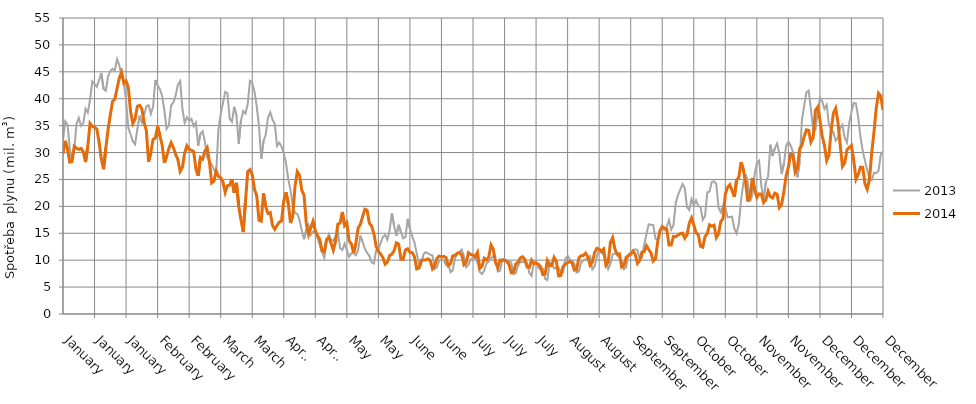
| Category | 2013 | 2014 |
|---|---|---|
| 2014-01-01 | 32.376 | 29.82 |
| 2014-01-02 | 35.793 | 32.181 |
| 2014-01-03 | 35.21 | 30.611 |
| 2014-01-04 | 30.842 | 28.224 |
| 2014-01-05 | 28.424 | 28.324 |
| 2014-01-06 | 30.508 | 31.172 |
| 2014-01-07 | 35.327 | 30.817 |
| 2014-01-08 | 36.448 | 30.577 |
| 2014-01-09 | 34.966 | 30.778 |
| 2014-01-10 | 35.419 | 30.133 |
| 2014-01-11 | 38.147 | 28.232 |
| 2014-01-12 | 37.43 | 31.153 |
| 2014-01-13 | 39.765 | 35.426 |
| 2014-01-14 | 43.228 | 34.839 |
| 2014-01-15 | 42.74 | 34.682 |
| 2014-01-16 | 42.229 | 34.385 |
| 2014-01-17 | 43.467 | 32.005 |
| 2014-01-18 | 44.768 | 28.838 |
| 2014-01-19 | 41.827 | 26.915 |
| 2014-01-20 | 41.464 | 30.805 |
| 2014-01-21 | 44.137 | 34.269 |
| 2014-01-22 | 45.154 | 36.969 |
| 2014-01-23 | 45.558 | 39.516 |
| 2014-01-24 | 45.237 | 39.913 |
| 2014-01-25 | 47.333 | 41.907 |
| 2014-01-26 | 46.198 | 43.864 |
| 2014-01-27 | 44.24 | 44.959 |
| 2014-01-28 | 43.061 | 42.901 |
| 2014-01-29 | 39.625 | 43.3 |
| 2014-01-30 | 34.589 | 42.101 |
| 2014-01-31 | 33.34 | 37.605 |
| 2014-02-01 | 32.074 | 35.402 |
| 2014-02-02 | 31.529 | 36.256 |
| 2014-02-03 | 34.36 | 38.573 |
| 2014-02-04 | 36.834 | 38.774 |
| 2014-02-05 | 35.587 | 38.146 |
| 2014-02-06 | 36.952 | 35.601 |
| 2014-02-07 | 38.576 | 34.087 |
| 2014-02-08 | 38.79 | 28.272 |
| 2014-02-09 | 37.172 | 30.067 |
| 2014-02-10 | 38.555 | 32.449 |
| 2014-02-11 | 43.474 | 32.699 |
| 2014-02-12 | 42.481 | 34.883 |
| 2014-02-13 | 41.749 | 33.102 |
| 2014-02-14 | 40.527 | 31.441 |
| 2014-02-15 | 37.804 | 28.101 |
| 2014-02-16 | 34.402 | 29.299 |
| 2014-02-17 | 35.141 | 30.772 |
| 2014-02-18 | 38.759 | 31.843 |
| 2014-02-19 | 39.327 | 30.935 |
| 2014-02-20 | 40.591 | 29.665 |
| 2014-02-21 | 42.629 | 28.691 |
| 2014-02-22 | 43.266 | 26.488 |
| 2014-02-23 | 38.174 | 27.234 |
| 2014-02-24 | 35.521 | 29.906 |
| 2014-02-25 | 36.541 | 31.251 |
| 2014-02-26 | 35.922 | 30.589 |
| 2014-02-27 | 36.258 | 30.439 |
| 2014-02-28 | 34.882 | 30.176 |
| 2014-03-01 | 35.558 | 26.972 |
| 2014-03-02 | 31.279 | 25.663 |
| 2014-03-03 | 33.478 | 29.095 |
| 2014-03-04 | 33.95 | 28.784 |
| 2014-03-05 | 31.968 | 30.254 |
| 2014-03-06 | 29.166 | 30.9 |
| 2014-03-07 | 28.263 | 28.308 |
| 2014-03-08 | 27.794 | 24.338 |
| 2014-03-09 | 26.809 | 24.66 |
| 2014-03-10 | 26.168 | 26.562 |
| 2014-03-11 | 34.32 | 25.574 |
| 2014-03-12 | 37.177 | 25.344 |
| 2014-03-13 | 39.187 | 24.546 |
| 2014-03-14 | 41.267 | 22.59 |
| 2014-03-15 | 41.026 | 23.848 |
| 2014-03-16 | 36.273 | 23.956 |
| 2014-03-17 | 35.707 | 25.066 |
| 2014-03-18 | 38.486 | 22.511 |
| 2014-03-19 | 36.897 | 24.371 |
| 2014-03-20 | 31.613 | 20.079 |
| 2014-03-21 | 35.967 | 17.453 |
| 2014-03-22 | 37.7 | 15.233 |
| 2014-03-23 | 37.236 | 20.937 |
| 2014-03-24 | 39.01 | 26.456 |
| 2014-03-25 | 43.322 | 26.817 |
| 2014-03-26 | 42.96 | 25.922 |
| 2014-03-27 | 41.318 | 23.174 |
| 2014-03-28 | 38.564 | 21.96 |
| 2014-03-29 | 34.957 | 17.409 |
| 2014-03-30 | 28.849 | 17.253 |
| 2014-03-31 | 32.112 | 22.417 |
| 2014-04-01 | 33.361 | 19.913 |
| 2014-04-02 | 36.491 | 18.679 |
| 2014-04-03 | 37.49 | 18.853 |
| 2014-04-04 | 36.084 | 16.457 |
| 2014-04-05 | 35.336 | 15.742 |
| 2014-04-06 | 31.221 | 16.457 |
| 2014-04-07 | 31.847 | 17.07 |
| 2014-04-08 | 31.129 | 17.279 |
| 2014-04-09 | 29.838 | 20.99 |
| 2014-04-10 | 28.022 | 22.604 |
| 2014-04-11 | 25.047 | 20.575 |
| 2014-04-12 | 23.005 | 16.912 |
| 2014-04-13 | 20.113 | 18.289 |
| 2014-04-14 | 18.796 | 23.767 |
| 2014-04-15 | 18.589 | 26.464 |
| 2014-04-16 | 17.46 | 25.756 |
| 2014-04-17 | 15.497 | 22.989 |
| 2014-04-18 | 13.898 | 22.107 |
| 2014-04-19 | 15.681 | 16.761 |
| 2014-04-20 | 16.576 | 14.747 |
| 2014-04-21 | 14.706 | 15.992 |
| 2014-04-22 | 15.291 | 17.229 |
| 2014-04-23 | 14.912 | 15.478 |
| 2014-04-24 | 14.147 | 14.555 |
| 2014-04-25 | 12.78 | 13.828 |
| 2014-04-26 | 11.422 | 11.757 |
| 2014-04-27 | 10.43 | 11.546 |
| 2014-04-28 | 13.422 | 13.87 |
| 2014-04-29 | 14.823 | 14.203 |
| 2014-04-30 | 13.827 | 13.119 |
| 2014-05-01 | 13.576 | 11.84 |
| 2014-05-02 | 14.447 | 13.531 |
| 2014-05-03 | 15.286 | 16.691 |
| 2014-05-04 | 12.215 | 16.898 |
| 2014-05-05 | 11.903 | 18.958 |
| 2014-05-06 | 13.077 | 16.412 |
| 2014-05-07 | 11.894 | 16.923 |
| 2014-05-08 | 10.628 | 13.589 |
| 2014-05-09 | 11.271 | 13.035 |
| 2014-05-10 | 11.317 | 11.395 |
| 2014-05-11 | 10.92 | 13.101 |
| 2014-05-12 | 11.847 | 15.969 |
| 2014-05-13 | 14.53 | 16.661 |
| 2014-05-14 | 13.425 | 18.088 |
| 2014-05-15 | 12.132 | 19.465 |
| 2014-05-16 | 11.361 | 19.279 |
| 2014-05-17 | 10.781 | 16.828 |
| 2014-05-18 | 9.617 | 16.379 |
| 2014-05-19 | 9.388 | 14.918 |
| 2014-05-20 | 11.813 | 12.583 |
| 2014-05-21 | 12 | 11.656 |
| 2014-05-22 | 13.191 | 11.132 |
| 2014-05-23 | 14.31 | 10.478 |
| 2014-05-24 | 14.698 | 9.278 |
| 2014-05-25 | 13.8 | 9.656 |
| 2014-05-26 | 15.615 | 10.866 |
| 2014-05-27 | 18.75 | 11.109 |
| 2014-05-28 | 16.366 | 11.809 |
| 2014-05-29 | 14.502 | 13.226 |
| 2014-05-30 | 16.586 | 12.988 |
| 2014-05-31 | 15.247 | 10.185 |
| 2014-06-01 | 14.068 | 10.152 |
| 2014-06-02 | 14.284 | 11.905 |
| 2014-06-03 | 17.667 | 12.107 |
| 2014-06-04 | 15.87 | 11.447 |
| 2014-06-05 | 14.467 | 11.438 |
| 2014-06-06 | 13.277 | 10.651 |
| 2014-06-07 | 11.324 | 8.371 |
| 2014-06-08 | 9.197 | 8.523 |
| 2014-06-09 | 9.082 | 9.971 |
| 2014-06-10 | 11.078 | 10.028 |
| 2014-06-11 | 11.485 | 10.044 |
| 2014-06-12 | 11.284 | 10.241 |
| 2014-06-13 | 11.01 | 9.964 |
| 2014-06-14 | 10.914 | 8.394 |
| 2014-06-15 | 8.349 | 8.962 |
| 2014-06-16 | 8.697 | 10.347 |
| 2014-06-17 | 9.974 | 10.761 |
| 2014-06-18 | 10.104 | 10.601 |
| 2014-06-19 | 10.037 | 10.714 |
| 2014-06-20 | 9.089 | 10.507 |
| 2014-06-21 | 9.375 | 9.013 |
| 2014-06-22 | 7.746 | 9.332 |
| 2014-06-23 | 8.13 | 10.793 |
| 2014-06-24 | 10.301 | 10.893 |
| 2014-06-25 | 11.16 | 11.273 |
| 2014-06-26 | 11.523 | 11.412 |
| 2014-06-27 | 11.957 | 10.932 |
| 2014-06-28 | 10.728 | 9.155 |
| 2014-06-29 | 8.701 | 9.581 |
| 2014-06-30 | 9.167 | 11.386 |
| 2014-07-01 | 10.198 | 11.058 |
| 2014-07-02 | 10.355 | 10.945 |
| 2014-07-03 | 10.447 | 10.6 |
| 2014-07-04 | 9.637 | 11.434 |
| 2014-07-05 | 7.812 | 8.493 |
| 2014-07-06 | 7.434 | 8.861 |
| 2014-07-07 | 8.051 | 10.347 |
| 2014-07-08 | 9.423 | 10.041 |
| 2014-07-09 | 9.745 | 10.6 |
| 2014-07-10 | 10.311 | 12.823 |
| 2014-07-11 | 10.735 | 12.053 |
| 2014-07-12 | 10.32 | 9.57 |
| 2014-07-13 | 7.898 | 8.633 |
| 2014-07-14 | 8.037 | 10.024 |
| 2014-07-15 | 10.124 | 9.977 |
| 2014-07-16 | 10.333 | 9.934 |
| 2014-07-17 | 9.53 | 9.835 |
| 2014-07-18 | 9.914 | 9.179 |
| 2014-07-19 | 9.567 | 7.672 |
| 2014-07-20 | 7.393 | 7.804 |
| 2014-07-21 | 7.651 | 9.301 |
| 2014-07-22 | 8.974 | 9.613 |
| 2014-07-23 | 9.696 | 10.428 |
| 2014-07-24 | 9.603 | 10.63 |
| 2014-07-25 | 9.818 | 10.15 |
| 2014-07-26 | 9.457 | 8.739 |
| 2014-07-27 | 7.647 | 8.655 |
| 2014-07-28 | 7.082 | 10.007 |
| 2014-07-29 | 9.479 | 9.354 |
| 2014-07-30 | 9.775 | 9.452 |
| 2014-07-31 | 8.559 | 9.247 |
| 2014-08-01 | 8.281 | 8.753 |
| 2014-08-02 | 8.408 | 7.34 |
| 2014-08-03 | 6.562 | 7.426 |
| 2014-08-04 | 6.288 | 9.929 |
| 2014-08-05 | 9.544 | 9.006 |
| 2014-08-06 | 9.275 | 9.029 |
| 2014-08-07 | 8.467 | 10.52 |
| 2014-08-08 | 8.583 | 9.784 |
| 2014-08-09 | 8.562 | 7.091 |
| 2014-08-10 | 7.859 | 7.163 |
| 2014-08-11 | 7.786 | 8.833 |
| 2014-08-12 | 10.258 | 9.249 |
| 2014-08-13 | 10.836 | 9.55 |
| 2014-08-14 | 10.13 | 9.739 |
| 2014-08-15 | 9.877 | 9.465 |
| 2014-08-16 | 9.389 | 8.167 |
| 2014-08-17 | 7.708 | 8.264 |
| 2014-08-18 | 7.896 | 10.437 |
| 2014-08-19 | 9.576 | 10.817 |
| 2014-08-20 | 9.953 | 10.876 |
| 2014-08-21 | 10.157 | 11.292 |
| 2014-08-22 | 10.387 | 10.609 |
| 2014-08-23 | 10.739 | 9.077 |
| 2014-08-24 | 8.28 | 9.681 |
| 2014-08-25 | 8.804 | 11.402 |
| 2014-08-26 | 10.717 | 12.199 |
| 2014-08-27 | 11.891 | 12.04 |
| 2014-08-28 | 11.407 | 11.614 |
| 2014-08-29 | 10.979 | 12.056 |
| 2014-08-30 | 10.106 | 9.031 |
| 2014-08-31 | 8.358 | 9.591 |
| 2014-09-01 | 9.321 | 13.327 |
| 2014-09-02 | 11.074 | 14.197 |
| 2014-09-03 | 11.277 | 12.059 |
| 2014-09-04 | 10.901 | 11.153 |
| 2014-09-05 | 10.488 | 11.189 |
| 2014-09-06 | 9.822 | 8.718 |
| 2014-09-07 | 8.302 | 9.013 |
| 2014-09-08 | 8.699 | 10.548 |
| 2014-09-09 | 10.995 | 10.863 |
| 2014-09-10 | 11.449 | 11.09 |
| 2014-09-11 | 11.804 | 11.667 |
| 2014-09-12 | 12.028 | 11.077 |
| 2014-09-13 | 11.87 | 9.402 |
| 2014-09-14 | 10.22 | 9.952 |
| 2014-09-15 | 10.465 | 11.503 |
| 2014-09-16 | 12.822 | 11.575 |
| 2014-09-17 | 14.864 | 12.671 |
| 2014-09-18 | 16.669 | 11.99 |
| 2014-09-19 | 16.575 | 11.364 |
| 2014-09-20 | 16.527 | 9.821 |
| 2014-09-21 | 14.005 | 10.25 |
| 2014-09-22 | 13.755 | 13.442 |
| 2014-09-23 | 15.566 | 15.491 |
| 2014-09-24 | 15.919 | 16.249 |
| 2014-09-25 | 15.573 | 15.94 |
| 2014-09-26 | 16.167 | 15.785 |
| 2014-09-27 | 17.459 | 12.817 |
| 2014-09-28 | 15.679 | 12.839 |
| 2014-09-29 | 16.502 | 14.428 |
| 2014-09-30 | 20.599 | 14.343 |
| 2014-10-01 | 22.132 | 14.673 |
| 2014-10-02 | 23.106 | 14.937 |
| 2014-10-03 | 24.155 | 15.024 |
| 2014-10-04 | 23.372 | 14.082 |
| 2014-10-05 | 19.838 | 14.704 |
| 2014-10-06 | 19.324 | 16.851 |
| 2014-10-07 | 21.353 | 17.837 |
| 2014-10-08 | 20.17 | 16.557 |
| 2014-10-09 | 21.117 | 15.093 |
| 2014-10-10 | 20.039 | 14.757 |
| 2014-10-11 | 19.909 | 12.578 |
| 2014-10-12 | 17.475 | 12.42 |
| 2014-10-13 | 18.207 | 14.38 |
| 2014-10-14 | 22.589 | 14.976 |
| 2014-10-15 | 22.767 | 16.573 |
| 2014-10-16 | 24.55 | 16.323 |
| 2014-10-17 | 24.644 | 16.501 |
| 2014-10-18 | 24.168 | 14.212 |
| 2014-10-19 | 19.773 | 14.948 |
| 2014-10-20 | 18.881 | 17.188 |
| 2014-10-21 | 20.205 | 17.722 |
| 2014-10-22 | 19.771 | 22.243 |
| 2014-10-23 | 17.971 | 23.528 |
| 2014-10-24 | 18.007 | 24.017 |
| 2014-10-25 | 18.081 | 22.938 |
| 2014-10-26 | 15.942 | 21.764 |
| 2014-10-27 | 14.959 | 24.888 |
| 2014-10-28 | 16.734 | 25.371 |
| 2014-10-29 | 21.103 | 28.228 |
| 2014-10-30 | 24.312 | 26.824 |
| 2014-10-31 | 25.982 | 24.493 |
| 2014-11-01 | 24.273 | 20.912 |
| 2014-11-02 | 20.95 | 21.982 |
| 2014-11-03 | 22.277 | 25.28 |
| 2014-11-04 | 25.969 | 23.073 |
| 2014-11-05 | 28.003 | 21.651 |
| 2014-11-06 | 28.487 | 22.316 |
| 2014-11-07 | 23.774 | 22.276 |
| 2014-11-08 | 21.436 | 20.699 |
| 2014-11-09 | 24.495 | 21.201 |
| 2014-11-10 | 25.533 | 22.811 |
| 2014-11-11 | 31.455 | 21.805 |
| 2014-11-12 | 29.337 | 21.558 |
| 2014-11-13 | 30.812 | 22.455 |
| 2014-11-14 | 31.664 | 22.258 |
| 2014-11-15 | 29.761 | 19.787 |
| 2014-11-16 | 26.006 | 20.345 |
| 2014-11-17 | 27.931 | 22.739 |
| 2014-11-18 | 31.255 | 25.684 |
| 2014-11-19 | 32.025 | 27.278 |
| 2014-11-20 | 31.324 | 29.719 |
| 2014-11-21 | 30.146 | 29.621 |
| 2014-11-22 | 27.946 | 26.333 |
| 2014-11-23 | 25.393 | 27.115 |
| 2014-11-24 | 28.17 | 30.725 |
| 2014-11-25 | 36.009 | 31.346 |
| 2014-11-26 | 38.692 | 32.962 |
| 2014-11-27 | 41.179 | 34.212 |
| 2014-11-28 | 41.513 | 34.112 |
| 2014-11-29 | 38.034 | 31.937 |
| 2014-11-30 | 34.17 | 32.779 |
| 2014-12-01 | 34.206 | 37.855 |
| 2014-12-02 | 37.361 | 38.441 |
| 2014-12-03 | 40.217 | 36.11 |
| 2014-12-04 | 39.542 | 33.026 |
| 2014-12-05 | 38.109 | 31.364 |
| 2014-12-06 | 38.88 | 28.518 |
| 2014-12-07 | 35.206 | 29.519 |
| 2014-12-08 | 34.265 | 34.21 |
| 2014-12-09 | 33.75 | 37.339 |
| 2014-12-10 | 32.206 | 38.205 |
| 2014-12-11 | 32.745 | 35.645 |
| 2014-12-12 | 34.568 | 31.431 |
| 2014-12-13 | 35.171 | 27.421 |
| 2014-12-14 | 32.715 | 28.083 |
| 2014-12-15 | 31.865 | 30.53 |
| 2014-12-16 | 35.512 | 30.919 |
| 2014-12-17 | 37.508 | 31.288 |
| 2014-12-18 | 39.224 | 28.573 |
| 2014-12-19 | 39.112 | 25.03 |
| 2014-12-20 | 36.507 | 25.922 |
| 2014-12-21 | 32.889 | 27.286 |
| 2014-12-22 | 30.301 | 27.236 |
| 2014-12-23 | 28.48 | 24.183 |
| 2014-12-24 | 26.734 | 23.168 |
| 2014-12-25 | 25.254 | 25.05 |
| 2014-12-26 | 24.876 | 30.002 |
| 2014-12-27 | 26.229 | 33.82 |
| 2014-12-28 | 26.209 | 38.257 |
| 2014-12-29 | 26.599 | 41.016 |
| 2014-12-30 | 29.599 | 40.532 |
| 2014-12-31 | 30.261 | 37.874 |